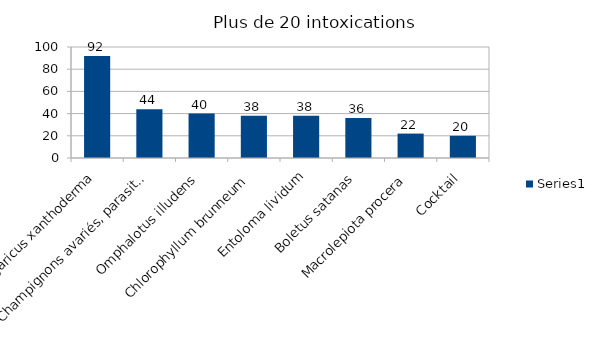
| Category | Series 0 |
|---|---|
| Agaricus xanthoderma | 92 |
| Champignons avariés, parasités | 44 |
| Omphalotus illudens | 40 |
| Chlorophyllum brunneum | 38 |
| Entoloma lividum | 38 |
| Boletus satanas | 36 |
| Macrolepiota procera | 22 |
| Cocktail | 20 |